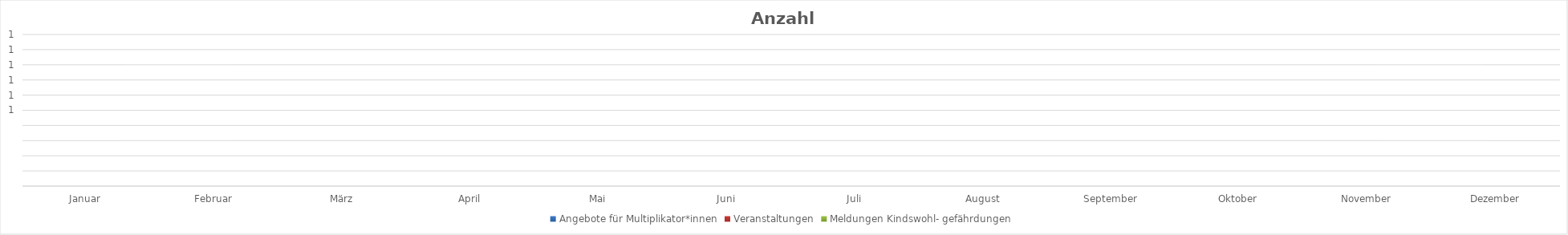
| Category | Angebote für Multiplikator*innen | Veranstaltungen | Meldungen Kindswohl- gefährdungen  |
|---|---|---|---|
| Januar | 0 | 0 | 0 |
| Februar | 0 | 0 | 0 |
| März | 0 | 0 | 0 |
| April | 0 | 0 | 0 |
| Mai | 0 | 0 | 0 |
| Juni | 0 | 0 | 0 |
| Juli | 0 | 0 | 0 |
| August | 0 | 0 | 0 |
| September | 0 | 0 | 0 |
| Oktober | 0 | 0 | 0 |
| November | 0 | 0 | 0 |
| Dezember | 0 | 0 | 0 |